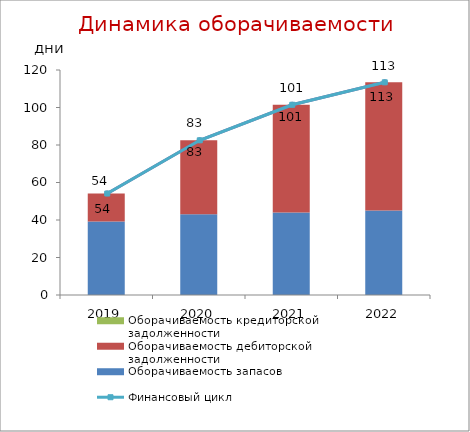
| Category | Оборачиваемость запасов | Оборачиваемость дебиторской задолженности | Оборачиваемость кредиторской задолженности |
|---|---|---|---|
| 2019.0 | 39.158 | 14.971 | 0 |
| 2020.0 | 43.105 | 39.403 | 0 |
| 2021.0 | 44.058 | 57.406 | 0 |
| 2022.0 | 45.063 | 68.367 | 0 |